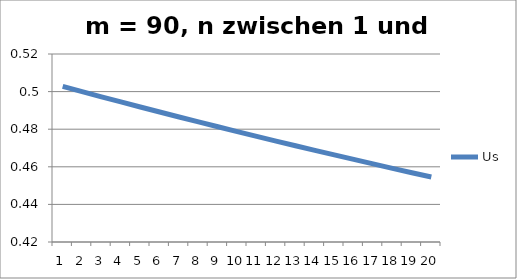
| Category | Us |
|---|---|
| 0 | 0.503 |
| 1 | 0.5 |
| 2 | 0.497 |
| 3 | 0.495 |
| 4 | 0.492 |
| 5 | 0.489 |
| 6 | 0.486 |
| 7 | 0.484 |
| 8 | 0.481 |
| 9 | 0.479 |
| 10 | 0.476 |
| 11 | 0.474 |
| 12 | 0.471 |
| 13 | 0.469 |
| 14 | 0.466 |
| 15 | 0.464 |
| 16 | 0.462 |
| 17 | 0.459 |
| 18 | 0.457 |
| 19 | 0.455 |